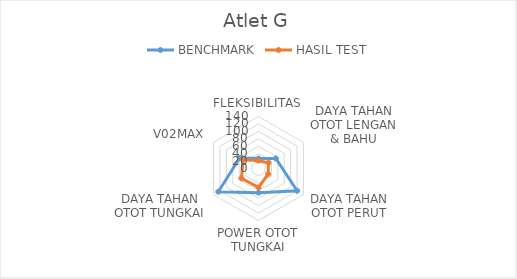
| Category | BENCHMARK | HASIL TEST |
|---|---|---|
| 0 | 27 | 21 |
| 1 | 54 | 31 |
| 2 | 120 | 30 |
| 3 | 65 | 51 |
| 4 | 125 | 53 |
| 5 | 58 | 47.8 |